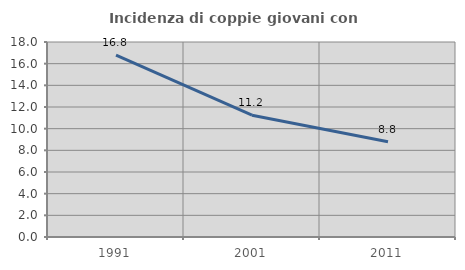
| Category | Incidenza di coppie giovani con figli |
|---|---|
| 1991.0 | 16.779 |
| 2001.0 | 11.24 |
| 2011.0 | 8.799 |